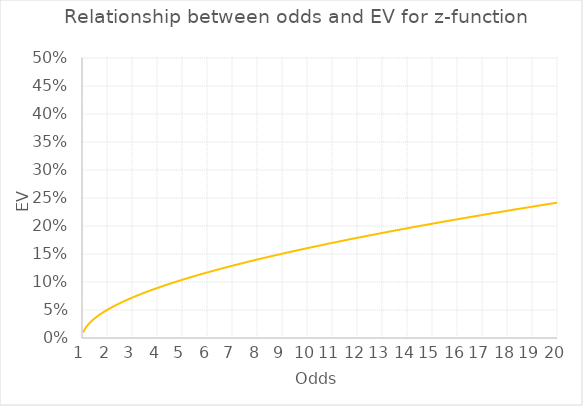
| Category | EV-Odds t-score function |
|---|---|
| 1.05 | 0.01 |
| 1.1 | 0.015 |
| 1.1500000000000001 | 0.018 |
| 1.2000000000000002 | 0.021 |
| 1.2500000000000002 | 0.024 |
| 1.3000000000000003 | 0.027 |
| 1.3500000000000003 | 0.029 |
| 1.4000000000000004 | 0.031 |
| 1.4500000000000004 | 0.033 |
| 1.5000000000000004 | 0.035 |
| 1.5500000000000005 | 0.037 |
| 1.6000000000000005 | 0.038 |
| 1.6500000000000006 | 0.04 |
| 1.7000000000000006 | 0.041 |
| 1.7500000000000007 | 0.043 |
| 1.8000000000000007 | 0.044 |
| 1.8500000000000008 | 0.046 |
| 1.9000000000000008 | 0.047 |
| 1.9500000000000008 | 0.049 |
| 2.000000000000001 | 0.05 |
| 2.0500000000000007 | 0.051 |
| 2.1000000000000005 | 0.053 |
| 2.1500000000000004 | 0.054 |
| 2.2 | 0.055 |
| 2.25 | 0.056 |
| 2.3 | 0.057 |
| 2.3499999999999996 | 0.059 |
| 2.3999999999999995 | 0.06 |
| 2.4499999999999993 | 0.061 |
| 2.499999999999999 | 0.062 |
| 2.549999999999999 | 0.063 |
| 2.5999999999999988 | 0.064 |
| 2.6499999999999986 | 0.065 |
| 2.6999999999999984 | 0.066 |
| 2.7499999999999982 | 0.067 |
| 2.799999999999998 | 0.068 |
| 2.849999999999998 | 0.069 |
| 2.8999999999999977 | 0.07 |
| 2.9499999999999975 | 0.071 |
| 2.9999999999999973 | 0.072 |
| 3.049999999999997 | 0.073 |
| 3.099999999999997 | 0.074 |
| 3.149999999999997 | 0.075 |
| 3.1999999999999966 | 0.076 |
| 3.2499999999999964 | 0.077 |
| 3.2999999999999963 | 0.077 |
| 3.349999999999996 | 0.078 |
| 3.399999999999996 | 0.079 |
| 3.4499999999999957 | 0.08 |
| 3.4999999999999956 | 0.081 |
| 3.5499999999999954 | 0.082 |
| 3.599999999999995 | 0.083 |
| 3.649999999999995 | 0.083 |
| 3.699999999999995 | 0.084 |
| 3.7499999999999947 | 0.085 |
| 3.7999999999999945 | 0.086 |
| 3.8499999999999943 | 0.087 |
| 3.899999999999994 | 0.088 |
| 3.949999999999994 | 0.088 |
| 3.999999999999994 | 0.089 |
| 4.049999999999994 | 0.09 |
| 4.099999999999993 | 0.091 |
| 4.149999999999993 | 0.091 |
| 4.199999999999993 | 0.092 |
| 4.249999999999993 | 0.093 |
| 4.299999999999993 | 0.094 |
| 4.3499999999999925 | 0.094 |
| 4.399999999999992 | 0.095 |
| 4.449999999999992 | 0.096 |
| 4.499999999999992 | 0.097 |
| 4.549999999999992 | 0.097 |
| 4.599999999999992 | 0.098 |
| 4.6499999999999915 | 0.099 |
| 4.699999999999991 | 0.1 |
| 4.749999999999991 | 0.1 |
| 4.799999999999991 | 0.101 |
| 4.849999999999991 | 0.102 |
| 4.899999999999991 | 0.102 |
| 4.94999999999999 | 0.103 |
| 4.99999999999999 | 0.104 |
| 5.04999999999999 | 0.105 |
| 5.09999999999999 | 0.105 |
| 5.14999999999999 | 0.106 |
| 5.1999999999999895 | 0.107 |
| 5.249999999999989 | 0.107 |
| 5.299999999999989 | 0.108 |
| 5.349999999999989 | 0.109 |
| 5.399999999999989 | 0.109 |
| 5.449999999999989 | 0.11 |
| 5.4999999999999885 | 0.111 |
| 5.549999999999988 | 0.111 |
| 5.599999999999988 | 0.112 |
| 5.649999999999988 | 0.112 |
| 5.699999999999988 | 0.113 |
| 5.749999999999988 | 0.114 |
| 5.799999999999987 | 0.114 |
| 5.849999999999987 | 0.115 |
| 5.899999999999987 | 0.116 |
| 5.949999999999987 | 0.116 |
| 5.999999999999987 | 0.117 |
| 6.0499999999999865 | 0.118 |
| 6.099999999999986 | 0.118 |
| 6.149999999999986 | 0.119 |
| 6.199999999999986 | 0.119 |
| 6.249999999999986 | 0.12 |
| 6.299999999999986 | 0.121 |
| 6.349999999999985 | 0.121 |
| 6.399999999999985 | 0.122 |
| 6.449999999999985 | 0.122 |
| 6.499999999999985 | 0.123 |
| 6.549999999999985 | 0.124 |
| 6.5999999999999845 | 0.124 |
| 6.649999999999984 | 0.125 |
| 6.699999999999984 | 0.125 |
| 6.749999999999984 | 0.126 |
| 6.799999999999984 | 0.127 |
| 6.849999999999984 | 0.127 |
| 6.8999999999999835 | 0.128 |
| 6.949999999999983 | 0.128 |
| 6.999999999999983 | 0.129 |
| 7.049999999999983 | 0.129 |
| 7.099999999999983 | 0.13 |
| 7.149999999999983 | 0.131 |
| 7.199999999999982 | 0.131 |
| 7.249999999999982 | 0.132 |
| 7.299999999999982 | 0.132 |
| 7.349999999999982 | 0.133 |
| 7.399999999999982 | 0.133 |
| 7.4499999999999815 | 0.134 |
| 7.499999999999981 | 0.135 |
| 7.549999999999981 | 0.135 |
| 7.599999999999981 | 0.136 |
| 7.649999999999981 | 0.136 |
| 7.699999999999981 | 0.137 |
| 7.7499999999999805 | 0.137 |
| 7.79999999999998 | 0.138 |
| 7.84999999999998 | 0.138 |
| 7.89999999999998 | 0.139 |
| 7.94999999999998 | 0.139 |
| 7.99999999999998 | 0.14 |
| 8.04999999999998 | 0.141 |
| 8.09999999999998 | 0.141 |
| 8.14999999999998 | 0.142 |
| 8.199999999999982 | 0.142 |
| 8.249999999999982 | 0.143 |
| 8.299999999999983 | 0.143 |
| 8.349999999999984 | 0.144 |
| 8.399999999999984 | 0.144 |
| 8.449999999999985 | 0.145 |
| 8.499999999999986 | 0.145 |
| 8.549999999999986 | 0.146 |
| 8.599999999999987 | 0.146 |
| 8.649999999999988 | 0.147 |
| 8.699999999999989 | 0.147 |
| 8.74999999999999 | 0.148 |
| 8.79999999999999 | 0.148 |
| 8.84999999999999 | 0.149 |
| 8.899999999999991 | 0.149 |
| 8.949999999999992 | 0.15 |
| 8.999999999999993 | 0.15 |
| 9.049999999999994 | 0.151 |
| 9.099999999999994 | 0.151 |
| 9.149999999999995 | 0.152 |
| 9.199999999999996 | 0.152 |
| 9.249999999999996 | 0.153 |
| 9.299999999999997 | 0.153 |
| 9.349999999999998 | 0.154 |
| 9.399999999999999 | 0.154 |
| 9.45 | 0.155 |
| 9.5 | 0.155 |
| 9.55 | 0.156 |
| 9.600000000000001 | 0.156 |
| 9.650000000000002 | 0.157 |
| 9.700000000000003 | 0.157 |
| 9.750000000000004 | 0.158 |
| 9.800000000000004 | 0.158 |
| 9.850000000000005 | 0.159 |
| 9.900000000000006 | 0.159 |
| 9.950000000000006 | 0.16 |
| 10.000000000000007 | 0.16 |
| 10.050000000000008 | 0.161 |
| 10.100000000000009 | 0.161 |
| 10.15000000000001 | 0.162 |
| 10.20000000000001 | 0.162 |
| 10.25000000000001 | 0.163 |
| 10.300000000000011 | 0.163 |
| 10.350000000000012 | 0.164 |
| 10.400000000000013 | 0.164 |
| 10.450000000000014 | 0.165 |
| 10.500000000000014 | 0.165 |
| 10.550000000000015 | 0.166 |
| 10.600000000000016 | 0.166 |
| 10.650000000000016 | 0.167 |
| 10.700000000000017 | 0.167 |
| 10.750000000000018 | 0.167 |
| 10.800000000000018 | 0.168 |
| 10.85000000000002 | 0.168 |
| 10.90000000000002 | 0.169 |
| 10.95000000000002 | 0.169 |
| 11.000000000000021 | 0.17 |
| 11.050000000000022 | 0.17 |
| 11.100000000000023 | 0.171 |
| 11.150000000000023 | 0.171 |
| 11.200000000000024 | 0.172 |
| 11.250000000000025 | 0.172 |
| 11.300000000000026 | 0.173 |
| 11.350000000000026 | 0.173 |
| 11.400000000000027 | 0.173 |
| 11.450000000000028 | 0.174 |
| 11.500000000000028 | 0.174 |
| 11.55000000000003 | 0.175 |
| 11.60000000000003 | 0.175 |
| 11.65000000000003 | 0.176 |
| 11.700000000000031 | 0.176 |
| 11.750000000000032 | 0.177 |
| 11.800000000000033 | 0.177 |
| 11.850000000000033 | 0.177 |
| 11.900000000000034 | 0.178 |
| 11.950000000000035 | 0.178 |
| 12.000000000000036 | 0.179 |
| 12.050000000000036 | 0.179 |
| 12.100000000000037 | 0.18 |
| 12.150000000000038 | 0.18 |
| 12.200000000000038 | 0.181 |
| 12.250000000000039 | 0.181 |
| 12.30000000000004 | 0.181 |
| 12.35000000000004 | 0.182 |
| 12.400000000000041 | 0.182 |
| 12.450000000000042 | 0.183 |
| 12.500000000000043 | 0.183 |
| 12.550000000000043 | 0.184 |
| 12.600000000000044 | 0.184 |
| 12.650000000000045 | 0.184 |
| 12.700000000000045 | 0.185 |
| 12.750000000000046 | 0.185 |
| 12.800000000000047 | 0.186 |
| 12.850000000000048 | 0.186 |
| 12.900000000000048 | 0.187 |
| 12.950000000000049 | 0.187 |
| 13.00000000000005 | 0.188 |
| 13.05000000000005 | 0.188 |
| 13.100000000000051 | 0.188 |
| 13.150000000000052 | 0.189 |
| 13.200000000000053 | 0.189 |
| 13.250000000000053 | 0.19 |
| 13.300000000000054 | 0.19 |
| 13.350000000000055 | 0.19 |
| 13.400000000000055 | 0.191 |
| 13.450000000000056 | 0.191 |
| 13.500000000000057 | 0.192 |
| 13.550000000000058 | 0.192 |
| 13.600000000000058 | 0.193 |
| 13.650000000000059 | 0.193 |
| 13.70000000000006 | 0.193 |
| 13.75000000000006 | 0.194 |
| 13.800000000000061 | 0.194 |
| 13.850000000000062 | 0.195 |
| 13.900000000000063 | 0.195 |
| 13.950000000000063 | 0.195 |
| 14.000000000000064 | 0.196 |
| 14.050000000000065 | 0.196 |
| 14.100000000000065 | 0.197 |
| 14.150000000000066 | 0.197 |
| 14.200000000000067 | 0.198 |
| 14.250000000000068 | 0.198 |
| 14.300000000000068 | 0.198 |
| 14.350000000000069 | 0.199 |
| 14.40000000000007 | 0.199 |
| 14.45000000000007 | 0.2 |
| 14.500000000000071 | 0.2 |
| 14.550000000000072 | 0.2 |
| 14.600000000000072 | 0.201 |
| 14.650000000000073 | 0.201 |
| 14.700000000000074 | 0.202 |
| 14.750000000000075 | 0.202 |
| 14.800000000000075 | 0.202 |
| 14.850000000000076 | 0.203 |
| 14.900000000000077 | 0.203 |
| 14.950000000000077 | 0.204 |
| 15.000000000000078 | 0.204 |
| 15.050000000000079 | 0.204 |
| 15.10000000000008 | 0.205 |
| 15.15000000000008 | 0.205 |
| 15.200000000000081 | 0.206 |
| 15.250000000000082 | 0.206 |
| 15.300000000000082 | 0.206 |
| 15.350000000000083 | 0.207 |
| 15.400000000000084 | 0.207 |
| 15.450000000000085 | 0.208 |
| 15.500000000000085 | 0.208 |
| 15.550000000000086 | 0.208 |
| 15.600000000000087 | 0.209 |
| 15.650000000000087 | 0.209 |
| 15.700000000000088 | 0.21 |
| 15.750000000000089 | 0.21 |
| 15.80000000000009 | 0.21 |
| 15.85000000000009 | 0.211 |
| 15.900000000000091 | 0.211 |
| 15.950000000000092 | 0.212 |
| 16.000000000000092 | 0.212 |
| 16.050000000000093 | 0.212 |
| 16.100000000000094 | 0.213 |
| 16.150000000000095 | 0.213 |
| 16.200000000000095 | 0.213 |
| 16.250000000000096 | 0.214 |
| 16.300000000000097 | 0.214 |
| 16.350000000000097 | 0.215 |
| 16.400000000000098 | 0.215 |
| 16.4500000000001 | 0.215 |
| 16.5000000000001 | 0.216 |
| 16.5500000000001 | 0.216 |
| 16.6000000000001 | 0.217 |
| 16.6500000000001 | 0.217 |
| 16.700000000000102 | 0.217 |
| 16.750000000000103 | 0.218 |
| 16.800000000000104 | 0.218 |
| 16.850000000000104 | 0.218 |
| 16.900000000000105 | 0.219 |
| 16.950000000000106 | 0.219 |
| 17.000000000000107 | 0.22 |
| 17.050000000000107 | 0.22 |
| 17.100000000000108 | 0.22 |
| 17.15000000000011 | 0.221 |
| 17.20000000000011 | 0.221 |
| 17.25000000000011 | 0.222 |
| 17.30000000000011 | 0.222 |
| 17.35000000000011 | 0.222 |
| 17.400000000000112 | 0.223 |
| 17.450000000000113 | 0.223 |
| 17.500000000000114 | 0.223 |
| 17.550000000000114 | 0.224 |
| 17.600000000000115 | 0.224 |
| 17.650000000000116 | 0.225 |
| 17.700000000000117 | 0.225 |
| 17.750000000000117 | 0.225 |
| 17.800000000000118 | 0.226 |
| 17.85000000000012 | 0.226 |
| 17.90000000000012 | 0.226 |
| 17.95000000000012 | 0.227 |
| 18.00000000000012 | 0.227 |
| 18.05000000000012 | 0.227 |
| 18.100000000000122 | 0.228 |
| 18.150000000000123 | 0.228 |
| 18.200000000000124 | 0.229 |
| 18.250000000000124 | 0.229 |
| 18.300000000000125 | 0.229 |
| 18.350000000000126 | 0.23 |
| 18.400000000000126 | 0.23 |
| 18.450000000000127 | 0.23 |
| 18.500000000000128 | 0.231 |
| 18.55000000000013 | 0.231 |
| 18.60000000000013 | 0.232 |
| 18.65000000000013 | 0.232 |
| 18.70000000000013 | 0.232 |
| 18.75000000000013 | 0.233 |
| 18.800000000000132 | 0.233 |
| 18.850000000000133 | 0.233 |
| 18.900000000000134 | 0.234 |
| 18.950000000000134 | 0.234 |
| 19.000000000000135 | 0.234 |
| 19.050000000000136 | 0.235 |
| 19.100000000000136 | 0.235 |
| 19.150000000000137 | 0.236 |
| 19.200000000000138 | 0.236 |
| 19.25000000000014 | 0.236 |
| 19.30000000000014 | 0.237 |
| 19.35000000000014 | 0.237 |
| 19.40000000000014 | 0.237 |
| 19.45000000000014 | 0.238 |
| 19.500000000000142 | 0.238 |
| 19.550000000000143 | 0.238 |
| 19.600000000000144 | 0.239 |
| 19.650000000000144 | 0.239 |
| 19.700000000000145 | 0.239 |
| 19.750000000000146 | 0.24 |
| 19.800000000000146 | 0.24 |
| 19.850000000000147 | 0.241 |
| 19.900000000000148 | 0.241 |
| 19.95000000000015 | 0.241 |
| 20.00000000000015 | 0.242 |
| 20.05000000000015 | 0.242 |
| 20.10000000000015 | 0.242 |
| 20.15000000000015 | 0.243 |
| 20.200000000000152 | 0.243 |
| 20.250000000000153 | 0.243 |
| 20.300000000000153 | 0.244 |
| 20.350000000000154 | 0.244 |
| 20.400000000000155 | 0.244 |
| 20.450000000000156 | 0.245 |
| 20.500000000000156 | 0.245 |
| 20.550000000000157 | 0.245 |
| 20.600000000000158 | 0.246 |
| 20.65000000000016 | 0.246 |
| 20.70000000000016 | 0.247 |
| 20.75000000000016 | 0.247 |
| 20.80000000000016 | 0.247 |
| 20.85000000000016 | 0.248 |
| 20.900000000000162 | 0.248 |
| 20.950000000000163 | 0.248 |
| 21.000000000000163 | 0.249 |
| 21.050000000000164 | 0.249 |
| 21.100000000000165 | 0.249 |
| 21.150000000000166 | 0.25 |
| 21.200000000000166 | 0.25 |
| 21.250000000000167 | 0.25 |
| 21.300000000000168 | 0.251 |
| 21.35000000000017 | 0.251 |
| 21.40000000000017 | 0.251 |
| 21.45000000000017 | 0.252 |
| 21.50000000000017 | 0.252 |
| 21.55000000000017 | 0.252 |
| 21.600000000000172 | 0.253 |
| 21.650000000000173 | 0.253 |
| 21.700000000000173 | 0.253 |
| 21.750000000000174 | 0.254 |
| 21.800000000000175 | 0.254 |
| 21.850000000000176 | 0.254 |
| 21.900000000000176 | 0.255 |
| 21.950000000000177 | 0.255 |
| 22.000000000000178 | 0.255 |
| 22.05000000000018 | 0.256 |
| 22.10000000000018 | 0.256 |
| 22.15000000000018 | 0.257 |
| 22.20000000000018 | 0.257 |
| 22.25000000000018 | 0.257 |
| 22.300000000000182 | 0.258 |
| 22.350000000000183 | 0.258 |
| 22.400000000000183 | 0.258 |
| 22.450000000000184 | 0.259 |
| 22.500000000000185 | 0.259 |
| 22.550000000000185 | 0.259 |
| 22.600000000000186 | 0.26 |
| 22.650000000000187 | 0.26 |
| 22.700000000000188 | 0.26 |
| 22.75000000000019 | 0.261 |
| 22.80000000000019 | 0.261 |
| 22.85000000000019 | 0.261 |
| 22.90000000000019 | 0.262 |
| 22.95000000000019 | 0.262 |
| 23.000000000000192 | 0.262 |
| 23.050000000000193 | 0.263 |
| 23.100000000000193 | 0.263 |
| 23.150000000000194 | 0.263 |
| 23.200000000000195 | 0.264 |
| 23.250000000000195 | 0.264 |
| 23.300000000000196 | 0.264 |
| 23.350000000000197 | 0.265 |
| 23.400000000000198 | 0.265 |
| 23.4500000000002 | 0.265 |
| 23.5000000000002 | 0.266 |
| 23.5500000000002 | 0.266 |
| 23.6000000000002 | 0.266 |
| 23.6500000000002 | 0.267 |
| 23.700000000000202 | 0.267 |
| 23.750000000000203 | 0.267 |
| 23.800000000000203 | 0.268 |
| 23.850000000000204 | 0.268 |
| 23.900000000000205 | 0.268 |
| 23.950000000000205 | 0.269 |
| 24.000000000000206 | 0.269 |
| 24.050000000000207 | 0.269 |
| 24.100000000000207 | 0.27 |
| 24.150000000000208 | 0.27 |
| 24.20000000000021 | 0.27 |
| 24.25000000000021 | 0.271 |
| 24.30000000000021 | 0.271 |
| 24.35000000000021 | 0.271 |
| 24.40000000000021 | 0.271 |
| 24.450000000000212 | 0.272 |
| 24.500000000000213 | 0.272 |
| 24.550000000000214 | 0.272 |
| 24.600000000000215 | 0.273 |
| 24.650000000000215 | 0.273 |
| 24.700000000000216 | 0.273 |
| 24.750000000000217 | 0.274 |
| 24.800000000000217 | 0.274 |
| 24.850000000000218 | 0.274 |
| 24.90000000000022 | 0.275 |
| 24.95000000000022 | 0.275 |
| 25.00000000000022 | 0.275 |
| 25.05000000000022 | 0.276 |
| 25.10000000000022 | 0.276 |
| 25.150000000000222 | 0.276 |
| 25.200000000000223 | 0.277 |
| 25.250000000000224 | 0.277 |
| 25.300000000000225 | 0.277 |
| 25.350000000000225 | 0.278 |
| 25.400000000000226 | 0.278 |
| 25.450000000000227 | 0.278 |
| 25.500000000000227 | 0.279 |
| 25.550000000000228 | 0.279 |
| 25.60000000000023 | 0.279 |
| 25.65000000000023 | 0.28 |
| 25.70000000000023 | 0.28 |
| 25.75000000000023 | 0.28 |
| 25.80000000000023 | 0.281 |
| 25.850000000000232 | 0.281 |
| 25.900000000000233 | 0.281 |
| 25.950000000000234 | 0.281 |
| 26.000000000000234 | 0.282 |
| 26.050000000000235 | 0.282 |
| 26.100000000000236 | 0.282 |
| 26.150000000000237 | 0.283 |
| 26.200000000000237 | 0.283 |
| 26.250000000000238 | 0.283 |
| 26.30000000000024 | 0.284 |
| 26.35000000000024 | 0.284 |
| 26.40000000000024 | 0.284 |
| 26.45000000000024 | 0.285 |
| 26.50000000000024 | 0.285 |
| 26.550000000000242 | 0.285 |
| 26.600000000000243 | 0.286 |
| 26.650000000000244 | 0.286 |
| 26.700000000000244 | 0.286 |
| 26.750000000000245 | 0.287 |
| 26.800000000000246 | 0.287 |
| 26.850000000000247 | 0.287 |
| 26.900000000000247 | 0.287 |
| 26.950000000000248 | 0.288 |
| 27.00000000000025 | 0.288 |
| 27.05000000000025 | 0.288 |
| 27.10000000000025 | 0.289 |
| 27.15000000000025 | 0.289 |
| 27.20000000000025 | 0.289 |
| 27.250000000000252 | 0.29 |
| 27.300000000000253 | 0.29 |
| 27.350000000000254 | 0.29 |
| 27.400000000000254 | 0.291 |
| 27.450000000000255 | 0.291 |
| 27.500000000000256 | 0.291 |
| 27.550000000000257 | 0.292 |
| 27.600000000000257 | 0.292 |
| 27.650000000000258 | 0.292 |
| 27.70000000000026 | 0.292 |
| 27.75000000000026 | 0.293 |
| 27.80000000000026 | 0.293 |
| 27.85000000000026 | 0.293 |
| 27.90000000000026 | 0.294 |
| 27.950000000000262 | 0.294 |
| 28.000000000000263 | 0.294 |
| 28.050000000000264 | 0.295 |
| 28.100000000000264 | 0.295 |
| 28.150000000000265 | 0.295 |
| 28.200000000000266 | 0.296 |
| 28.250000000000266 | 0.296 |
| 28.300000000000267 | 0.296 |
| 28.350000000000268 | 0.296 |
| 28.40000000000027 | 0.297 |
| 28.45000000000027 | 0.297 |
| 28.50000000000027 | 0.297 |
| 28.55000000000027 | 0.298 |
| 28.60000000000027 | 0.298 |
| 28.650000000000272 | 0.298 |
| 28.700000000000273 | 0.299 |
| 28.750000000000274 | 0.299 |
| 28.800000000000274 | 0.299 |
| 28.850000000000275 | 0.3 |
| 28.900000000000276 | 0.3 |
| 28.950000000000276 | 0.3 |
| 29.000000000000277 | 0.3 |
| 29.050000000000278 | 0.301 |
| 29.10000000000028 | 0.301 |
| 29.15000000000028 | 0.301 |
| 29.20000000000028 | 0.302 |
| 29.25000000000028 | 0.302 |
| 29.30000000000028 | 0.302 |
| 29.350000000000282 | 0.303 |
| 29.400000000000283 | 0.303 |
| 29.450000000000284 | 0.303 |
| 29.500000000000284 | 0.304 |
| 29.550000000000285 | 0.304 |
| 29.600000000000286 | 0.304 |
| 29.650000000000286 | 0.304 |
| 29.700000000000287 | 0.305 |
| 29.750000000000288 | 0.305 |
| 29.80000000000029 | 0.305 |
| 29.85000000000029 | 0.306 |
| 29.90000000000029 | 0.306 |
| 29.95000000000029 | 0.306 |
| 30.00000000000029 | 0.307 |
| 30.050000000000292 | 0.307 |
| 30.100000000000293 | 0.307 |
| 30.150000000000293 | 0.307 |
| 30.200000000000294 | 0.308 |
| 30.250000000000295 | 0.308 |
| 30.300000000000296 | 0.308 |
| 30.350000000000296 | 0.309 |
| 30.400000000000297 | 0.309 |
| 30.450000000000298 | 0.309 |
| 30.5000000000003 | 0.31 |
| 30.5500000000003 | 0.31 |
| 30.6000000000003 | 0.31 |
| 30.6500000000003 | 0.31 |
| 30.7000000000003 | 0.311 |
| 30.750000000000302 | 0.311 |
| 30.800000000000303 | 0.311 |
| 30.850000000000303 | 0.312 |
| 30.900000000000304 | 0.312 |
| 30.950000000000305 | 0.312 |
| 31.000000000000306 | 0.313 |
| 31.050000000000306 | 0.313 |
| 31.100000000000307 | 0.313 |
| 31.150000000000308 | 0.313 |
| 31.20000000000031 | 0.314 |
| 31.25000000000031 | 0.314 |
| 31.30000000000031 | 0.314 |
| 31.35000000000031 | 0.315 |
| 31.40000000000031 | 0.315 |
| 31.450000000000312 | 0.315 |
| 31.500000000000313 | 0.315 |
| 31.550000000000313 | 0.316 |
| 31.600000000000314 | 0.316 |
| 31.650000000000315 | 0.316 |
| 31.700000000000315 | 0.317 |
| 31.750000000000316 | 0.317 |
| 31.800000000000317 | 0.317 |
| 31.850000000000318 | 0.318 |
| 31.90000000000032 | 0.318 |
| 31.95000000000032 | 0.318 |
| 32.00000000000032 | 0.318 |
| 32.05000000000032 | 0.319 |
| 32.100000000000314 | 0.319 |
| 32.15000000000031 | 0.319 |
| 32.20000000000031 | 0.32 |
| 32.250000000000306 | 0.32 |
| 32.3000000000003 | 0.32 |
| 32.3500000000003 | 0.32 |
| 32.4000000000003 | 0.321 |
| 32.450000000000294 | 0.321 |
| 32.50000000000029 | 0.321 |
| 32.55000000000029 | 0.322 |
| 32.600000000000286 | 0.322 |
| 32.65000000000028 | 0.322 |
| 32.70000000000028 | 0.322 |
| 32.75000000000028 | 0.323 |
| 32.800000000000274 | 0.323 |
| 32.85000000000027 | 0.323 |
| 32.90000000000027 | 0.324 |
| 32.950000000000266 | 0.324 |
| 33.00000000000026 | 0.324 |
| 33.05000000000026 | 0.325 |
| 33.10000000000026 | 0.325 |
| 33.150000000000254 | 0.325 |
| 33.20000000000025 | 0.325 |
| 33.25000000000025 | 0.326 |
| 33.300000000000246 | 0.326 |
| 33.35000000000024 | 0.326 |
| 33.40000000000024 | 0.327 |
| 33.45000000000024 | 0.327 |
| 33.500000000000234 | 0.327 |
| 33.55000000000023 | 0.327 |
| 33.60000000000023 | 0.328 |
| 33.650000000000226 | 0.328 |
| 33.70000000000022 | 0.328 |
| 33.75000000000022 | 0.329 |
| 33.80000000000022 | 0.329 |
| 33.850000000000215 | 0.329 |
| 33.90000000000021 | 0.329 |
| 33.95000000000021 | 0.33 |
| 34.000000000000206 | 0.33 |
| 34.0500000000002 | 0.33 |
| 34.1000000000002 | 0.331 |
| 34.1500000000002 | 0.331 |
| 34.200000000000195 | 0.331 |
| 34.25000000000019 | 0.331 |
| 34.30000000000019 | 0.332 |
| 34.350000000000186 | 0.332 |
| 34.40000000000018 | 0.332 |
| 34.45000000000018 | 0.333 |
| 34.50000000000018 | 0.333 |
| 34.550000000000175 | 0.333 |
| 34.60000000000017 | 0.333 |
| 34.65000000000017 | 0.334 |
| 34.700000000000166 | 0.334 |
| 34.75000000000016 | 0.334 |
| 34.80000000000016 | 0.335 |
| 34.85000000000016 | 0.335 |
| 34.900000000000155 | 0.335 |
| 34.95000000000015 | 0.335 |
| 35.00000000000015 | 0.336 |
| 35.050000000000146 | 0.336 |
| 35.10000000000014 | 0.336 |
| 35.15000000000014 | 0.337 |
| 35.20000000000014 | 0.337 |
| 35.250000000000135 | 0.337 |
| 35.30000000000013 | 0.337 |
| 35.35000000000013 | 0.338 |
| 35.40000000000013 | 0.338 |
| 35.450000000000124 | 0.338 |
| 35.50000000000012 | 0.339 |
| 35.55000000000012 | 0.339 |
| 35.600000000000115 | 0.339 |
| 35.65000000000011 | 0.339 |
| 35.70000000000011 | 0.34 |
| 35.75000000000011 | 0.34 |
| 35.800000000000104 | 0.34 |
| 35.8500000000001 | 0.34 |
| 35.9000000000001 | 0.341 |
| 35.950000000000095 | 0.341 |
| 36.00000000000009 | 0.341 |
| 36.05000000000009 | 0.342 |
| 36.10000000000009 | 0.342 |
| 36.150000000000084 | 0.342 |
| 36.20000000000008 | 0.342 |
| 36.25000000000008 | 0.343 |
| 36.300000000000075 | 0.343 |
| 36.35000000000007 | 0.343 |
| 36.40000000000007 | 0.344 |
| 36.45000000000007 | 0.344 |
| 36.500000000000064 | 0.344 |
| 36.55000000000006 | 0.344 |
| 36.60000000000006 | 0.345 |
| 36.650000000000055 | 0.345 |
| 36.70000000000005 | 0.345 |
| 36.75000000000005 | 0.346 |
| 36.80000000000005 | 0.346 |
| 36.850000000000044 | 0.346 |
| 36.90000000000004 | 0.346 |
| 36.95000000000004 | 0.347 |
| 37.000000000000036 | 0.347 |
| 37.05000000000003 | 0.347 |
| 37.10000000000003 | 0.347 |
| 37.15000000000003 | 0.348 |
| 37.200000000000024 | 0.348 |
| 37.25000000000002 | 0.348 |
| 37.30000000000002 | 0.349 |
| 37.350000000000016 | 0.349 |
| 37.40000000000001 | 0.349 |
| 37.45000000000001 | 0.349 |
| 37.50000000000001 | 0.35 |
| 37.550000000000004 | 0.35 |
| 37.6 | 0.35 |
| 37.65 | 0.351 |
| 37.699999999999996 | 0.351 |
| 37.74999999999999 | 0.351 |
| 37.79999999999999 | 0.351 |
| 37.84999999999999 | 0.352 |
| 37.899999999999984 | 0.352 |
| 37.94999999999998 | 0.352 |
| 37.99999999999998 | 0.352 |
| 38.049999999999976 | 0.353 |
| 38.09999999999997 | 0.353 |
| 38.14999999999997 | 0.353 |
| 38.19999999999997 | 0.354 |
| 38.249999999999964 | 0.354 |
| 38.29999999999996 | 0.354 |
| 38.34999999999996 | 0.354 |
| 38.399999999999956 | 0.355 |
| 38.44999999999995 | 0.355 |
| 38.49999999999995 | 0.355 |
| 38.54999999999995 | 0.355 |
| 38.599999999999945 | 0.356 |
| 38.64999999999994 | 0.356 |
| 38.69999999999994 | 0.356 |
| 38.749999999999936 | 0.357 |
| 38.79999999999993 | 0.357 |
| 38.84999999999993 | 0.357 |
| 38.89999999999993 | 0.357 |
| 38.949999999999925 | 0.358 |
| 38.99999999999992 | 0.358 |
| 39.04999999999992 | 0.358 |
| 39.099999999999916 | 0.358 |
| 39.14999999999991 | 0.359 |
| 39.19999999999991 | 0.359 |
| 39.24999999999991 | 0.359 |
| 39.299999999999905 | 0.36 |
| 39.3499999999999 | 0.36 |
| 39.3999999999999 | 0.36 |
| 39.449999999999896 | 0.36 |
| 39.49999999999989 | 0.361 |
| 39.54999999999989 | 0.361 |
| 39.59999999999989 | 0.361 |
| 39.649999999999885 | 0.361 |
| 39.69999999999988 | 0.362 |
| 39.74999999999988 | 0.362 |
| 39.799999999999876 | 0.362 |
| 39.84999999999987 | 0.363 |
| 39.89999999999987 | 0.363 |
| 39.94999999999987 | 0.363 |
| 39.999999999999865 | 0.363 |
| 40.04999999999986 | 0.364 |
| 40.09999999999986 | 0.364 |
| 40.14999999999986 | 0.364 |
| 40.199999999999854 | 0.364 |
| 40.24999999999985 | 0.365 |
| 40.29999999999985 | 0.365 |
| 40.349999999999845 | 0.365 |
| 40.39999999999984 | 0.365 |
| 40.44999999999984 | 0.366 |
| 40.49999999999984 | 0.366 |
| 40.549999999999834 | 0.366 |
| 40.59999999999983 | 0.367 |
| 40.64999999999983 | 0.367 |
| 40.699999999999825 | 0.367 |
| 40.74999999999982 | 0.367 |
| 40.79999999999982 | 0.368 |
| 40.84999999999982 | 0.368 |
| 40.899999999999814 | 0.368 |
| 40.94999999999981 | 0.368 |
| 40.99999999999981 | 0.369 |
| 41.049999999999805 | 0.369 |
| 41.0999999999998 | 0.369 |
| 41.1499999999998 | 0.37 |
| 41.1999999999998 | 0.37 |
| 41.249999999999794 | 0.37 |
| 41.29999999999979 | 0.37 |
| 41.34999999999979 | 0.371 |
| 41.399999999999785 | 0.371 |
| 41.44999999999978 | 0.371 |
| 41.49999999999978 | 0.371 |
| 41.54999999999978 | 0.372 |
| 41.599999999999774 | 0.372 |
| 41.64999999999977 | 0.372 |
| 41.69999999999977 | 0.372 |
| 41.749999999999766 | 0.373 |
| 41.79999999999976 | 0.373 |
| 41.84999999999976 | 0.373 |
| 41.89999999999976 | 0.374 |
| 41.949999999999754 | 0.374 |
| 41.99999999999975 | 0.374 |
| 42.04999999999975 | 0.374 |
| 42.099999999999746 | 0.375 |
| 42.14999999999974 | 0.375 |
| 42.19999999999974 | 0.375 |
| 42.24999999999974 | 0.375 |
| 42.299999999999734 | 0.376 |
| 42.34999999999973 | 0.376 |
| 42.39999999999973 | 0.376 |
| 42.449999999999726 | 0.376 |
| 42.49999999999972 | 0.377 |
| 42.54999999999972 | 0.377 |
| 42.59999999999972 | 0.377 |
| 42.649999999999714 | 0.377 |
| 42.69999999999971 | 0.378 |
| 42.74999999999971 | 0.378 |
| 42.799999999999706 | 0.378 |
| 42.8499999999997 | 0.379 |
| 42.8999999999997 | 0.379 |
| 42.9499999999997 | 0.379 |
| 42.999999999999694 | 0.379 |
| 43.04999999999969 | 0.38 |
| 43.09999999999969 | 0.38 |
| 43.149999999999686 | 0.38 |
| 43.19999999999968 | 0.38 |
| 43.24999999999968 | 0.381 |
| 43.29999999999968 | 0.381 |
| 43.349999999999675 | 0.381 |
| 43.39999999999967 | 0.381 |
| 43.44999999999967 | 0.382 |
| 43.499999999999666 | 0.382 |
| 43.54999999999966 | 0.382 |
| 43.59999999999966 | 0.382 |
| 43.64999999999966 | 0.383 |
| 43.699999999999655 | 0.383 |
| 43.74999999999965 | 0.383 |
| 43.79999999999965 | 0.384 |
| 43.849999999999646 | 0.384 |
| 43.89999999999964 | 0.384 |
| 43.94999999999964 | 0.384 |
| 43.99999999999964 | 0.385 |
| 44.049999999999635 | 0.385 |
| 44.09999999999963 | 0.385 |
| 44.14999999999963 | 0.385 |
| 44.199999999999626 | 0.386 |
| 44.24999999999962 | 0.386 |
| 44.29999999999962 | 0.386 |
| 44.34999999999962 | 0.386 |
| 44.399999999999615 | 0.387 |
| 44.44999999999961 | 0.387 |
| 44.49999999999961 | 0.387 |
| 44.549999999999606 | 0.387 |
| 44.5999999999996 | 0.388 |
| 44.6499999999996 | 0.388 |
| 44.6999999999996 | 0.388 |
| 44.749999999999595 | 0.388 |
| 44.79999999999959 | 0.389 |
| 44.84999999999959 | 0.389 |
| 44.89999999999959 | 0.389 |
| 44.949999999999584 | 0.389 |
| 44.99999999999958 | 0.39 |
| 45.04999999999958 | 0.39 |
| 45.099999999999575 | 0.39 |
| 45.14999999999957 | 0.391 |
| 45.19999999999957 | 0.391 |
| 45.24999999999957 | 0.391 |
| 45.299999999999564 | 0.391 |
| 45.34999999999956 | 0.392 |
| 45.39999999999956 | 0.392 |
| 45.449999999999555 | 0.392 |
| 45.49999999999955 | 0.392 |
| 45.54999999999955 | 0.393 |
| 45.59999999999955 | 0.393 |
| 45.649999999999544 | 0.393 |
| 45.69999999999954 | 0.393 |
| 45.74999999999954 | 0.394 |
| 45.799999999999535 | 0.394 |
| 45.84999999999953 | 0.394 |
| 45.89999999999953 | 0.394 |
| 45.94999999999953 | 0.395 |
| 45.999999999999524 | 0.395 |
| 46.04999999999952 | 0.395 |
| 46.09999999999952 | 0.395 |
| 46.149999999999515 | 0.396 |
| 46.19999999999951 | 0.396 |
| 46.24999999999951 | 0.396 |
| 46.29999999999951 | 0.396 |
| 46.349999999999504 | 0.397 |
| 46.3999999999995 | 0.397 |
| 46.4499999999995 | 0.397 |
| 46.499999999999496 | 0.397 |
| 46.54999999999949 | 0.398 |
| 46.59999999999949 | 0.398 |
| 46.64999999999949 | 0.398 |
| 46.699999999999484 | 0.398 |
| 46.74999999999948 | 0.399 |
| 46.79999999999948 | 0.399 |
| 46.849999999999476 | 0.399 |
| 46.89999999999947 | 0.399 |
| 46.94999999999947 | 0.4 |
| 46.99999999999947 | 0.4 |
| 47.049999999999464 | 0.4 |
| 47.09999999999946 | 0.401 |
| 47.14999999999946 | 0.401 |
| 47.199999999999456 | 0.401 |
| 47.24999999999945 | 0.401 |
| 47.29999999999945 | 0.402 |
| 47.34999999999945 | 0.402 |
| 47.399999999999444 | 0.402 |
| 47.44999999999944 | 0.402 |
| 47.49999999999944 | 0.403 |
| 47.549999999999436 | 0.403 |
| 47.59999999999943 | 0.403 |
| 47.64999999999943 | 0.403 |
| 47.69999999999943 | 0.404 |
| 47.749999999999424 | 0.404 |
| 47.79999999999942 | 0.404 |
| 47.84999999999942 | 0.404 |
| 47.899999999999416 | 0.405 |
| 47.94999999999941 | 0.405 |
| 47.99999999999941 | 0.405 |
| 48.04999999999941 | 0.405 |
| 48.099999999999405 | 0.406 |
| 48.1499999999994 | 0.406 |
| 48.1999999999994 | 0.406 |
| 48.249999999999396 | 0.406 |
| 48.29999999999939 | 0.407 |
| 48.34999999999939 | 0.407 |
| 48.39999999999939 | 0.407 |
| 48.449999999999385 | 0.407 |
| 48.49999999999938 | 0.408 |
| 48.54999999999938 | 0.408 |
| 48.599999999999376 | 0.408 |
| 48.64999999999937 | 0.408 |
| 48.69999999999937 | 0.409 |
| 48.74999999999937 | 0.409 |
| 48.799999999999365 | 0.409 |
| 48.84999999999936 | 0.409 |
| 48.89999999999936 | 0.41 |
| 48.949999999999356 | 0.41 |
| 48.99999999999935 | 0.41 |
| 49.04999999999935 | 0.41 |
| 49.09999999999935 | 0.411 |
| 49.149999999999345 | 0.411 |
| 49.19999999999934 | 0.411 |
| 49.24999999999934 | 0.411 |
| 49.299999999999336 | 0.412 |
| 49.34999999999933 | 0.412 |
| 49.39999999999933 | 0.412 |
| 49.44999999999933 | 0.412 |
| 49.499999999999325 | 0.413 |
| 49.54999999999932 | 0.413 |
| 49.59999999999932 | 0.413 |
| 49.64999999999932 | 0.413 |
| 49.699999999999314 | 0.414 |
| 49.74999999999931 | 0.414 |
| 49.79999999999931 | 0.414 |
| 49.849999999999305 | 0.414 |
| 49.8999999999993 | 0.415 |
| 49.9499999999993 | 0.415 |
| 49.9999999999993 | 0.415 |
| 50.049999999999294 | 0.415 |
| 50.09999999999929 | 0.416 |
| 50.14999999999929 | 0.416 |
| 50.199999999999285 | 0.416 |
| 50.24999999999928 | 0.416 |
| 50.29999999999928 | 0.417 |
| 50.34999999999928 | 0.417 |
| 50.399999999999274 | 0.417 |
| 50.44999999999927 | 0.417 |
| 50.49999999999927 | 0.418 |
| 50.549999999999265 | 0.418 |
| 50.59999999999926 | 0.418 |
| 50.64999999999926 | 0.418 |
| 50.69999999999926 | 0.419 |
| 50.749999999999254 | 0.419 |
| 50.79999999999925 | 0.419 |
| 50.84999999999925 | 0.419 |
| 50.899999999999245 | 0.42 |
| 50.94999999999924 | 0.42 |
| 50.99999999999924 | 0.42 |